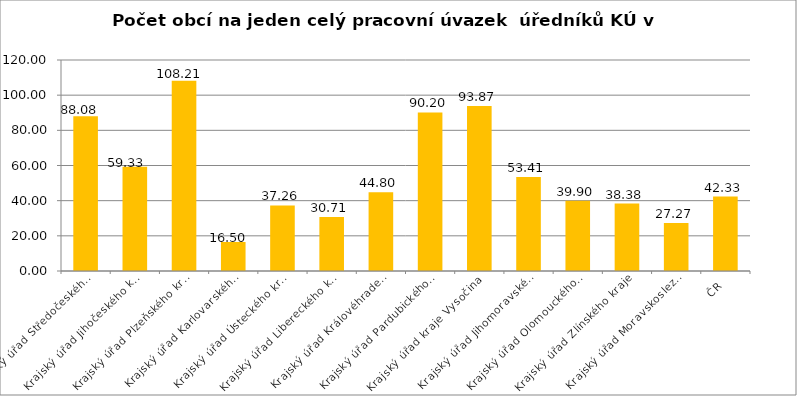
| Category | Počet obcí na jeden celý pracovní úvazek  úředníků KÚ |
|---|---|
| Krajský úřad Středočeského kraje | 88.08 |
| Krajský úřad Jihočeského kraje | 59.33 |
| Krajský úřad Plzeňského kraje | 108.21 |
| Krajský úřad Karlovarského kraje | 16.5 |
| Krajský úřad Ústeckého kraje | 37.26 |
| Krajský úřad Libereckého kraje | 30.71 |
| Krajský úřad Královéhradeckého kraje | 44.8 |
| Krajský úřad Pardubického kraje | 90.2 |
| Krajský úřad kraje Vysočina | 93.87 |
| Krajský úřad Jihomoravského kraje | 53.41 |
| Krajský úřad Olomouckého kraje | 39.9 |
| Krajský úřad Zlínského kraje | 38.38 |
| Krajský úřad Moravskoslezského kraje | 27.27 |
| ČR | 42.33 |